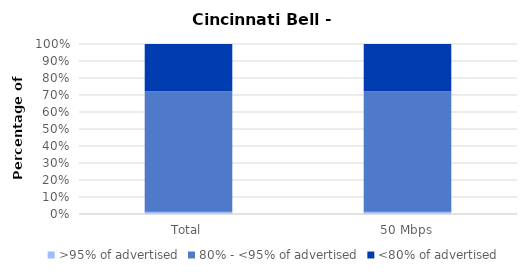
| Category | >95% of advertised | 80% - <95% of advertised | <80% of advertised |
|---|---|---|---|
| Total | 0.019 | 0.704 | 0.278 |
| 50 Mbps | 0.019 | 0.704 | 0.278 |